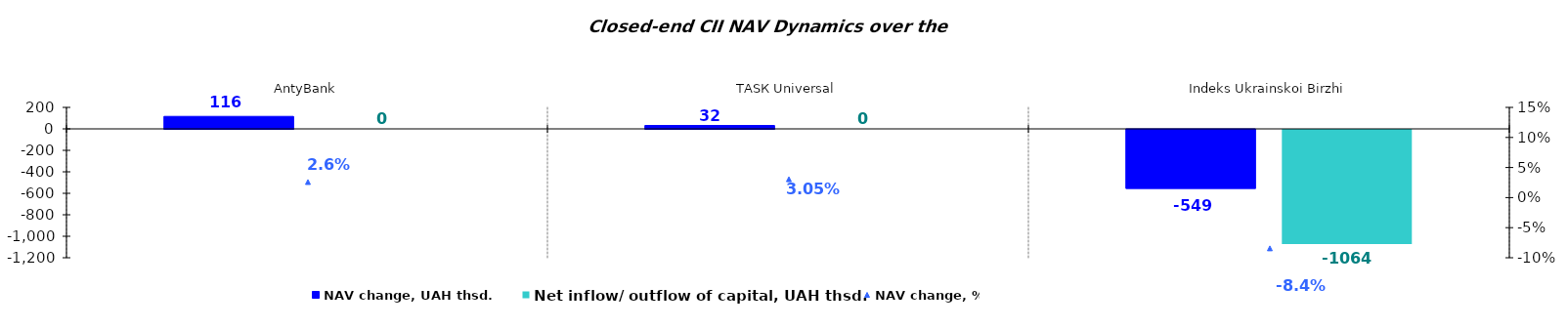
| Category | NAV change, UAH thsd. | Net inflow/ outflow of capital, UAH thsd. |
|---|---|---|
| AntyBank | 116.124 | 0 |
| ТАSК Universal | 31.603 | 0 |
| Indeks Ukrainskoi Birzhi | -548.99 | -1064.462 |